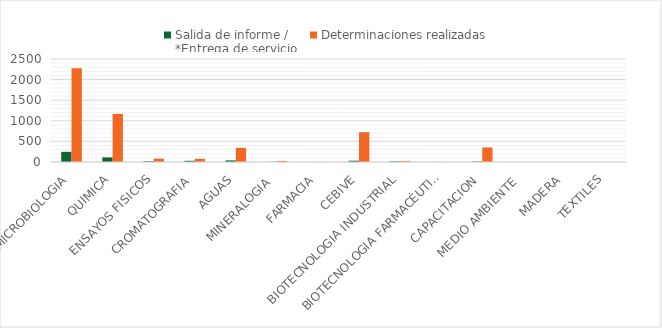
| Category | Salida de informe / 
*Entrega de servicio | Determinaciones realizadas  |
|---|---|---|
| MICROBIOLOGIA | 247 | 2277 |
| QUIMICA | 112 | 1167 |
| ENSAYOS FISICOS | 20 | 80 |
| CROMATOGRAFIA | 30 | 77 |
| AGUAS | 39 | 342 |
| MINERALOGIA  | 4 | 26 |
| FARMACIA | 1 | 2 |
| CEBIVE | 31 | 724 |
| BIOTECNOLOGIA INDUSTRIAL | 16 | 26 |
| BIOTECNOLOGIA FARMACÉUTICA | 2 | 2 |
| CAPACITACION | 13 | 353 |
| MEDIO AMBIENTE  | 0 | 0 |
| MADERA | 0 | 0 |
| TEXTILES | 0 | 0 |